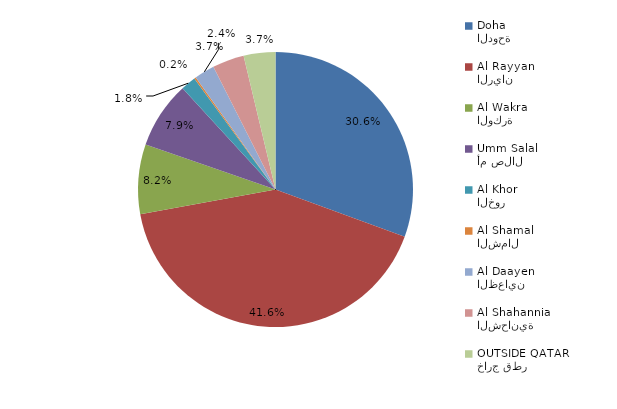
| Category | Series 0 |
|---|---|
| الدوحة
Doha | 295 |
| الريان
Al Rayyan | 401 |
| الوكرة
Al Wakra | 79 |
| أم صلال
Umm Salal | 76 |
| الخور
Al Khor | 17 |
| الشمال
Al Shamal | 2 |
| الظعاين
Al Daayen | 23 |
| الشحانية 
Al Shahannia | 36 |
| خارج قطر
OUTSIDE QATAR | 36 |